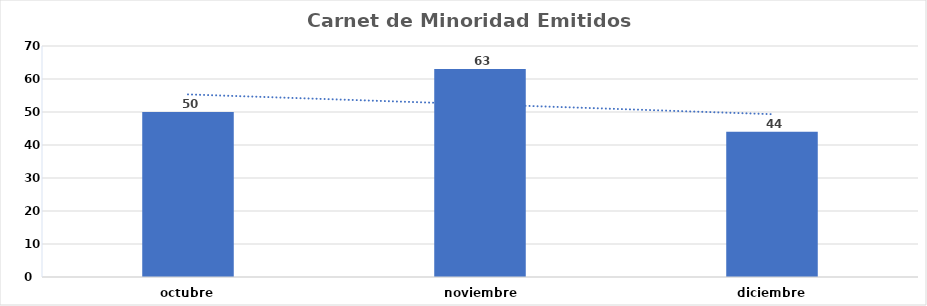
| Category | Series 0 |
|---|---|
| octubre | 50 |
| noviembre  | 63 |
| diciembre | 44 |